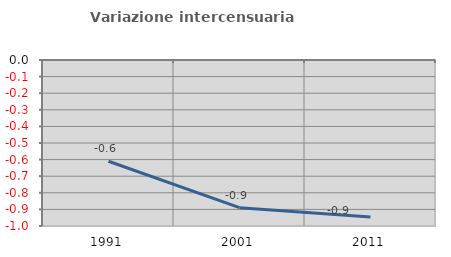
| Category | Variazione intercensuaria annua |
|---|---|
| 1991.0 | -0.61 |
| 2001.0 | -0.89 |
| 2011.0 | -0.946 |